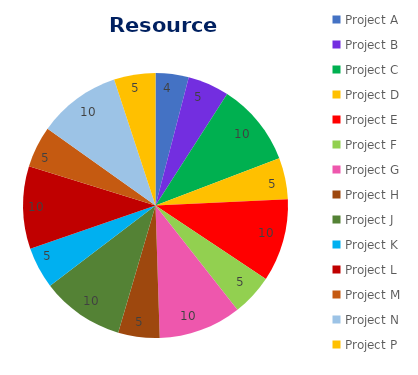
| Category | Series 0 |
|---|---|
| Project A | 4 |
| Project B | 5 |
| Project C | 10 |
| Project D | 5 |
| Project E | 10 |
| Project F | 5 |
| Project G | 10 |
| Project H | 5 |
| Project J | 10 |
| Project K | 5 |
| Project L | 10 |
| Project M | 5 |
| Project N | 10 |
| Project P | 5 |